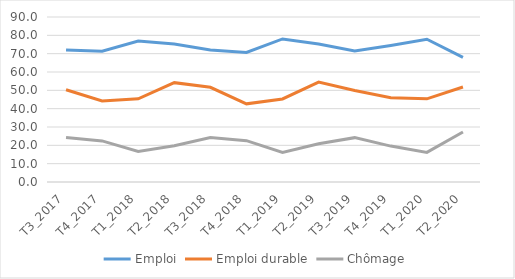
| Category | Emploi | Emploi durable | Chômage |
|---|---|---|---|
| T3_2017 | 71.965 | 50.295 | 24.226 |
| T4_2017 | 71.356 | 44.172 | 22.416 |
| T1_2018 | 76.899 | 45.407 | 16.706 |
| T2_2018 | 75.274 | 54.193 | 19.805 |
| T3_2018 | 72.047 | 51.663 | 24.314 |
| T4_2018 | 70.662 | 42.635 | 22.533 |
| T1_2019 | 78.028 | 45.31 | 16.093 |
| T2_2019 | 75.259 | 54.482 | 20.896 |
| T3_2019 | 71.487 | 49.882 | 24.189 |
| T4_2019 | 74.494 | 45.99 | 19.582 |
| T1_2020 | 77.894 | 45.368 | 16.158 |
| T2_2020 | 67.981 | 51.811 | 27.237 |